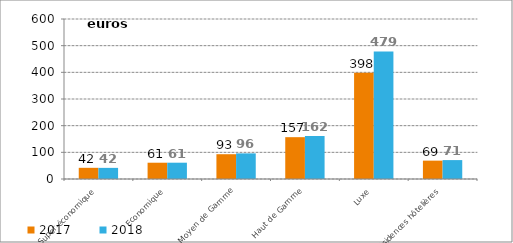
| Category | 2017 | 2018 |
|---|---|---|
| Super-économique | 41.932 | 41.731 |
| Economique | 61.061 | 61.122 |
| Moyen de Gamme | 92.955 | 96.078 |
| Haut de Gamme | 156.848 | 161.544 |
| Luxe | 397.976 | 478.578 |
| Résidences hôtelières | 68.841 | 70.91 |